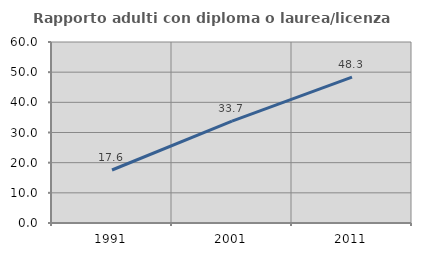
| Category | Rapporto adulti con diploma o laurea/licenza media  |
|---|---|
| 1991.0 | 17.573 |
| 2001.0 | 33.746 |
| 2011.0 | 48.348 |